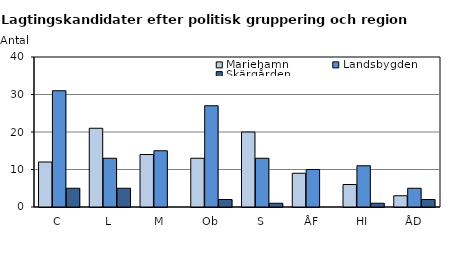
| Category | Mariehamn | Landsbygden | Skärgården |
|---|---|---|---|
| C | 12 | 31 | 5 |
| L | 21 | 13 | 5 |
| M | 14 | 15 | 0 |
| Ob | 13 | 27 | 2 |
| S | 20 | 13 | 1 |
| ÅF | 9 | 10 | 0 |
| HI | 6 | 11 | 1 |
| ÅD | 3 | 5 | 2 |